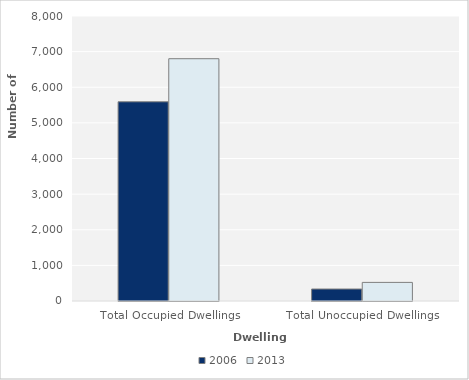
| Category | 2006 | 2013 |
|---|---|---|
| Total Occupied Dwellings | 5592 | 6801 |
| Total Unoccupied Dwellings | 336 | 522 |